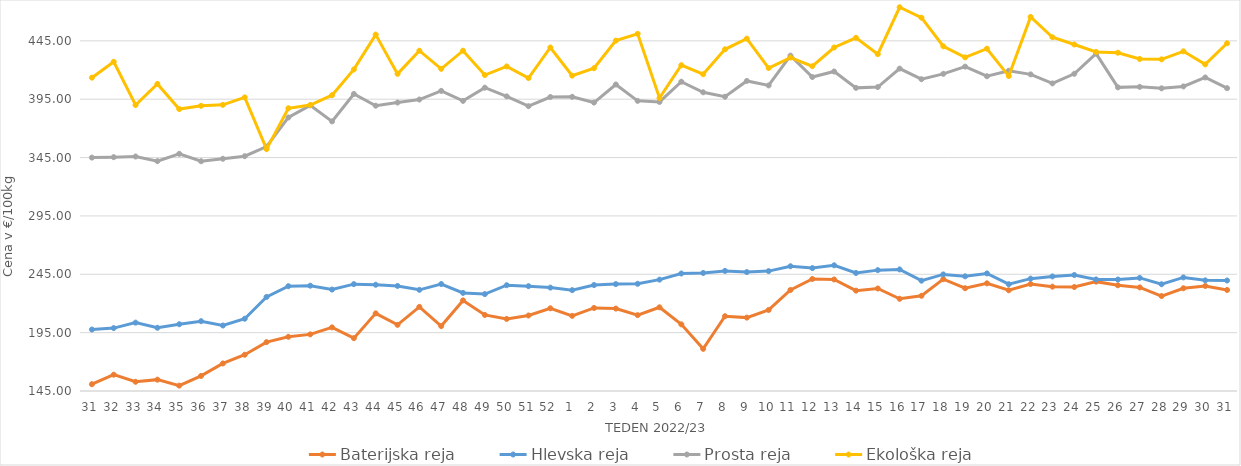
| Category | Baterijska reja | Hlevska reja | Prosta reja | Ekološka reja |
|---|---|---|---|---|
| 31.0 | 150.81 | 197.66 | 344.97 | 413.45 |
| 32.0 | 158.99 | 198.9 | 345.35 | 427.07 |
| 33.0 | 152.91 | 203.57 | 345.9 | 390 |
| 34.0 | 154.73 | 199.17 | 341.92 | 408.1 |
| 35.0 | 149.6 | 202.21 | 348.2 | 386.55 |
| 36.0 | 157.93 | 204.81 | 341.85 | 389.31 |
| 37.0 | 168.61 | 201.11 | 343.97 | 390.17 |
| 38.0 | 176.07 | 206.91 | 346.16 | 396.55 |
| 39.0 | 186.86 | 225.6 | 354.41 | 352.24 |
| 40.0 | 191.45 | 234.79 | 379.35 | 387.24 |
| 41.0 | 193.52 | 235.24 | 389.75 | 390 |
| 42.0 | 199.51 | 231.92 | 376.02 | 398.45 |
| 43.0 | 190.28 | 236.56 | 399.51 | 420.52 |
| 44.0 | 211.53 | 236.04 | 389.44 | 450.35 |
| 45.0 | 201.69 | 235.01 | 392.15 | 416.72 |
| 46.0 | 217.08 | 231.68 | 394.71 | 436.55 |
| 47.0 | 200.62 | 236.65 | 402.12 | 421.03 |
| 48.0 | 222.61 | 229.05 | 393.56 | 436.55 |
| 49.0 | 210.16 | 228.03 | 404.87 | 415.69 |
| 50.0 | 206.76 | 235.63 | 397.4 | 423.1 |
| 51.0 | 209.69 | 234.79 | 389.05 | 413.1 |
| 52.0 | 215.87 | 233.58 | 396.87 | 439.31 |
| 1.0 | 209.37 | 231.41 | 397.04 | 415.17 |
| 2.0 | 216.15 | 235.78 | 392.13 | 421.55 |
| 3.0 | 215.63 | 236.58 | 407.61 | 445.17 |
| 4.0 | 210 | 236.85 | 393.58 | 451.04 |
| 5.0 | 216.7 | 240.42 | 392.67 | 396.03 |
| 6.0 | 202.1 | 245.67 | 409.97 | 424.14 |
| 7.0 | 181.11 | 246.12 | 400.94 | 416.38 |
| 8.0 | 209.08 | 247.88 | 397.11 | 437.76 |
| 9.0 | 207.87 | 246.89 | 410.64 | 446.9 |
| 10.0 | 214.42 | 247.73 | 406.8 | 421.72 |
| 11.0 | 231.56 | 251.88 | 432.34 | 430.69 |
| 12.0 | 240.97 | 250.3 | 414 | 423.28 |
| 13.0 | 240.55 | 252.7 | 418.74 | 439.31 |
| 14.0 | 230.99 | 246.12 | 404.72 | 447.59 |
| 15.0 | 232.82 | 248.56 | 405.42 | 433.62 |
| 16.0 | 224 | 249.17 | 421.22 | 473.79 |
| 17.0 | 226.57 | 239.5 | 412.13 | 464.83 |
| 18.0 | 240.83 | 244.89 | 416.74 | 440.35 |
| 19.0 | 233.05 | 243.26 | 422.93 | 430.86 |
| 20.0 | 237.25 | 245.73 | 414.68 | 438.28 |
| 21.0 | 231.3 | 236.5 | 419.36 | 414.83 |
| 22.0 | 236.67 | 241.27 | 416.27 | 465.52 |
| 23.0 | 234.39 | 243.16 | 408.53 | 448.1 |
| 24.0 | 234.08 | 244.37 | 416.78 | 441.9 |
| 25.0 | 238.69 | 240.6 | 434.05 | 435.52 |
| 26.0 | 235.57 | 240.51 | 405.15 | 434.83 |
| 27.0 | 233.75 | 241.89 | 405.58 | 429.48 |
| 28.0 | 226.35 | 236.46 | 404.32 | 429.14 |
| 29.0 | 233.03 | 242.31 | 405.96 | 436.04 |
| 30.0 | 235 | 239.8 | 413.63 | 424.83 |
| 31.0 | 231.55 | 239.67 | 404.46 | 442.93 |